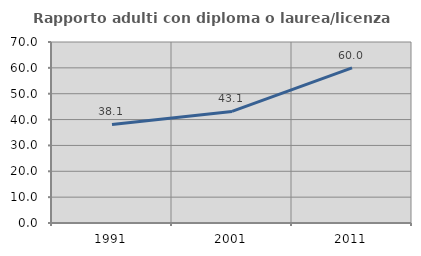
| Category | Rapporto adulti con diploma o laurea/licenza media  |
|---|---|
| 1991.0 | 38.095 |
| 2001.0 | 43.137 |
| 2011.0 | 60 |